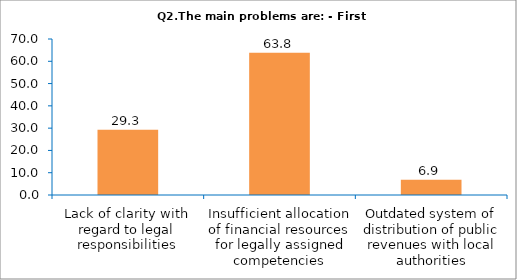
| Category | Series 0 |
|---|---|
| Lack of clarity with regard to legal responsibilities | 29.31 |
| Insufficient allocation of financial resources for legally assigned competencies | 63.793 |
| Outdated system of distribution of public revenues with local authorities | 6.897 |